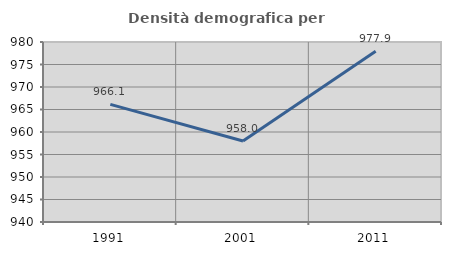
| Category | Densità demografica |
|---|---|
| 1991.0 | 966.137 |
| 2001.0 | 958.014 |
| 2011.0 | 977.922 |